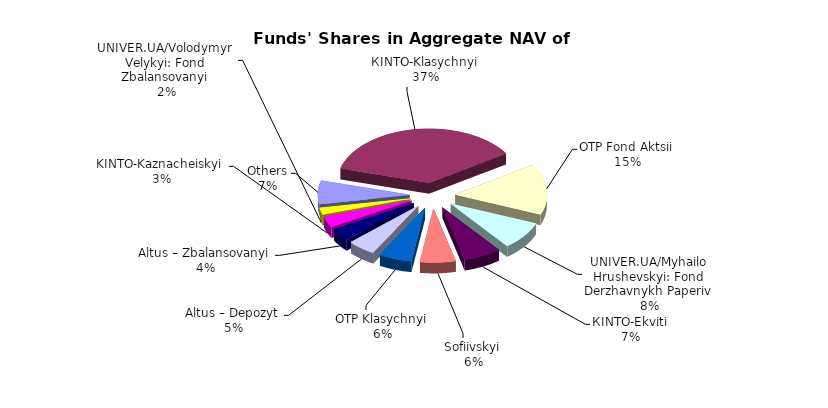
| Category | Series 0 | Series 1 |
|---|---|---|
| Others | 5958498.23 | 0.07 |
| КІNТО-Klasychnyi | 30935373.48 | 0.366 |
| ОТP Fond Aktsii | 12862890.99 | 0.152 |
| UNIVER.UA/Myhailo Hrushevskyi: Fond Derzhavnykh Paperiv | 7136327.83 | 0.084 |
| КІNTO-Ekviti | 5627987.73 | 0.067 |
| Sofiivskyi | 5292101.19 | 0.063 |
| ОТP Klasychnyi | 4930660.94 | 0.058 |
| Altus – Depozyt | 4165986.23 | 0.049 |
| Altus – Zbalansovanyi | 3180002.14 | 0.038 |
| KINTO-Kaznacheiskyi | 2778470.46 | 0.033 |
| UNIVER.UA/Volodymyr Velykyi: Fond Zbalansovanyi | 1736412.42 | 0.021 |